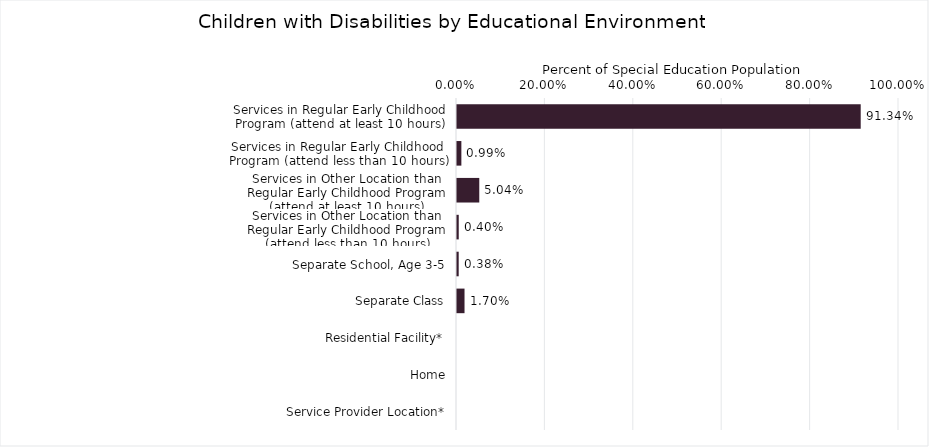
| Category | Percentage |
|---|---|
| Services in Regular Early Childhood Program (attend at least 10 hours) | 0.913 |
| Services in Regular Early Childhood Program (attend less than 10 hours) | 0.01 |
| Services in Other Location than Regular Early Childhood Program (attend at least 10 hours) | 0.05 |
| Services in Other Location than Regular Early Childhood Program (attend less than 10 hours) | 0.004 |
| Separate School, Age 3-5 | 0.004 |
| Separate Class | 0.017 |
| Residential Facility* | 0 |
| Home | 0 |
| Service Provider Location* | 0 |